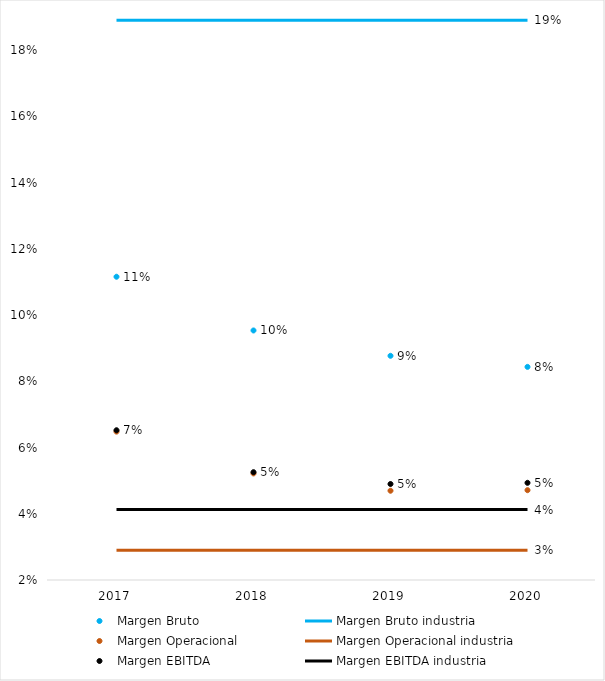
| Category |  Margen Bruto  |  Margen Bruto industria  |  Margen Operacional  |  Margen Operacional industria  |  Margen EBITDA  |  Margen EBITDA industria  |
|---|---|---|---|---|---|---|
| 2017.0 | 0.112 | 0.189 | 0.065 | 0.029 | 0.065 | 0.041 |
| 2018.0 | 0.095 | 0.189 | 0.052 | 0.029 | 0.053 | 0.041 |
| 2019.0 | 0.088 | 0.189 | 0.047 | 0.029 | 0.049 | 0.041 |
| 2020.0 | 0.084 | 0.189 | 0.047 | 0.029 | 0.049 | 0.041 |